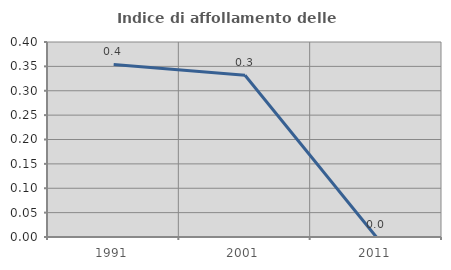
| Category | Indice di affollamento delle abitazioni  |
|---|---|
| 1991.0 | 0.354 |
| 2001.0 | 0.332 |
| 2011.0 | 0 |